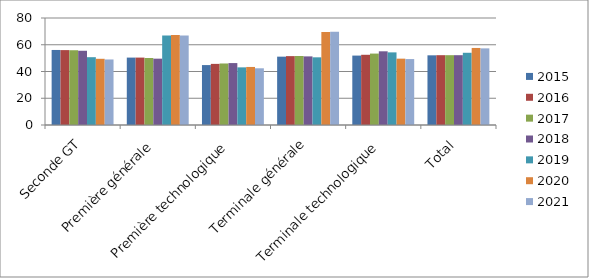
| Category | 2015 | 2016 | 2017 | 2018 | 2019 | 2020 | 2021 |
|---|---|---|---|---|---|---|---|
| Seconde GT | 56.1 | 56 | 55.9 | 55.5 | 50.7 | 49.5 | 49 |
| Première générale | 50.4 | 50.4 | 50.1 | 49.6 | 67 | 67.2 | 66.9 |
| Première technologique | 44.8 | 45.7 | 46 | 46.3 | 43.1 | 43.4 | 42.4 |
| Terminale générale | 51.1 | 51.5 | 51.6 | 51.3 | 50.6 | 69.5 | 69.8 |
| Terminale technologique | 51.9 | 52.5 | 53.4 | 55.1 | 54.3 | 49.6 | 49.3 |
| Total | 52.1 | 52.2 | 52.2 | 52.2 | 54 | 57.6 | 57.3 |